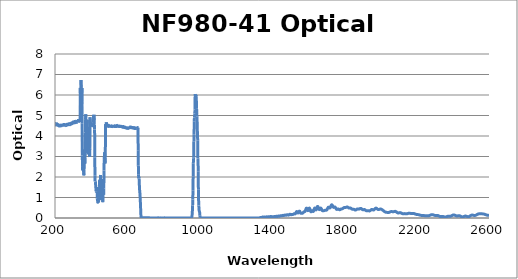
| Category | Optical Density |
|---|---|
| 2600.0 | 0.134 |
| 2599.0 | 0.133 |
| 2598.0 | 0.132 |
| 2597.0 | 0.131 |
| 2596.0 | 0.131 |
| 2595.0 | 0.132 |
| 2594.0 | 0.132 |
| 2593.0 | 0.133 |
| 2592.0 | 0.134 |
| 2591.0 | 0.135 |
| 2590.0 | 0.137 |
| 2589.0 | 0.139 |
| 2588.0 | 0.141 |
| 2587.0 | 0.144 |
| 2586.0 | 0.147 |
| 2585.0 | 0.15 |
| 2584.0 | 0.153 |
| 2583.0 | 0.157 |
| 2582.0 | 0.161 |
| 2581.0 | 0.164 |
| 2580.0 | 0.168 |
| 2579.0 | 0.171 |
| 2578.0 | 0.174 |
| 2577.0 | 0.177 |
| 2576.0 | 0.181 |
| 2575.0 | 0.184 |
| 2574.0 | 0.187 |
| 2573.0 | 0.189 |
| 2572.0 | 0.191 |
| 2571.0 | 0.193 |
| 2570.0 | 0.195 |
| 2569.0 | 0.197 |
| 2568.0 | 0.198 |
| 2567.0 | 0.199 |
| 2566.0 | 0.2 |
| 2565.0 | 0.201 |
| 2564.0 | 0.201 |
| 2563.0 | 0.202 |
| 2562.0 | 0.202 |
| 2561.0 | 0.203 |
| 2560.0 | 0.203 |
| 2559.0 | 0.203 |
| 2558.0 | 0.203 |
| 2557.0 | 0.204 |
| 2556.0 | 0.204 |
| 2555.0 | 0.204 |
| 2554.0 | 0.205 |
| 2553.0 | 0.205 |
| 2552.0 | 0.205 |
| 2551.0 | 0.205 |
| 2550.0 | 0.206 |
| 2549.0 | 0.206 |
| 2548.0 | 0.206 |
| 2547.0 | 0.205 |
| 2546.0 | 0.205 |
| 2545.0 | 0.204 |
| 2544.0 | 0.202 |
| 2543.0 | 0.201 |
| 2542.0 | 0.199 |
| 2541.0 | 0.196 |
| 2540.0 | 0.194 |
| 2539.0 | 0.19 |
| 2538.0 | 0.187 |
| 2537.0 | 0.183 |
| 2536.0 | 0.178 |
| 2535.0 | 0.174 |
| 2534.0 | 0.169 |
| 2533.0 | 0.164 |
| 2532.0 | 0.158 |
| 2531.0 | 0.153 |
| 2530.0 | 0.149 |
| 2529.0 | 0.144 |
| 2528.0 | 0.139 |
| 2527.0 | 0.135 |
| 2526.0 | 0.132 |
| 2525.0 | 0.129 |
| 2524.0 | 0.126 |
| 2523.0 | 0.125 |
| 2522.0 | 0.123 |
| 2521.0 | 0.123 |
| 2520.0 | 0.122 |
| 2519.0 | 0.123 |
| 2518.0 | 0.124 |
| 2517.0 | 0.125 |
| 2516.0 | 0.127 |
| 2515.0 | 0.129 |
| 2514.0 | 0.131 |
| 2513.0 | 0.134 |
| 2512.0 | 0.136 |
| 2511.0 | 0.138 |
| 2510.0 | 0.14 |
| 2509.0 | 0.141 |
| 2508.0 | 0.142 |
| 2507.0 | 0.143 |
| 2506.0 | 0.142 |
| 2505.0 | 0.141 |
| 2504.0 | 0.14 |
| 2503.0 | 0.137 |
| 2502.0 | 0.134 |
| 2501.0 | 0.131 |
| 2500.0 | 0.126 |
| 2499.0 | 0.121 |
| 2498.0 | 0.116 |
| 2497.0 | 0.11 |
| 2496.0 | 0.104 |
| 2495.0 | 0.098 |
| 2494.0 | 0.092 |
| 2493.0 | 0.087 |
| 2492.0 | 0.082 |
| 2491.0 | 0.077 |
| 2490.0 | 0.072 |
| 2489.0 | 0.069 |
| 2488.0 | 0.066 |
| 2487.0 | 0.063 |
| 2486.0 | 0.062 |
| 2485.0 | 0.062 |
| 2484.0 | 0.062 |
| 2483.0 | 0.063 |
| 2482.0 | 0.065 |
| 2481.0 | 0.067 |
| 2480.0 | 0.07 |
| 2479.0 | 0.073 |
| 2478.0 | 0.076 |
| 2477.0 | 0.079 |
| 2476.0 | 0.083 |
| 2475.0 | 0.086 |
| 2474.0 | 0.088 |
| 2473.0 | 0.091 |
| 2472.0 | 0.092 |
| 2471.0 | 0.094 |
| 2470.0 | 0.094 |
| 2469.0 | 0.094 |
| 2468.0 | 0.093 |
| 2467.0 | 0.091 |
| 2466.0 | 0.089 |
| 2465.0 | 0.086 |
| 2464.0 | 0.083 |
| 2463.0 | 0.079 |
| 2462.0 | 0.075 |
| 2461.0 | 0.071 |
| 2460.0 | 0.067 |
| 2459.0 | 0.064 |
| 2458.0 | 0.061 |
| 2457.0 | 0.058 |
| 2456.0 | 0.056 |
| 2455.0 | 0.054 |
| 2454.0 | 0.053 |
| 2453.0 | 0.054 |
| 2452.0 | 0.054 |
| 2451.0 | 0.056 |
| 2450.0 | 0.058 |
| 2449.0 | 0.062 |
| 2448.0 | 0.065 |
| 2447.0 | 0.069 |
| 2446.0 | 0.074 |
| 2445.0 | 0.079 |
| 2444.0 | 0.084 |
| 2443.0 | 0.088 |
| 2442.0 | 0.093 |
| 2441.0 | 0.098 |
| 2440.0 | 0.101 |
| 2439.0 | 0.105 |
| 2438.0 | 0.108 |
| 2437.0 | 0.11 |
| 2436.0 | 0.111 |
| 2435.0 | 0.112 |
| 2434.0 | 0.112 |
| 2433.0 | 0.112 |
| 2432.0 | 0.111 |
| 2431.0 | 0.11 |
| 2430.0 | 0.109 |
| 2429.0 | 0.107 |
| 2428.0 | 0.105 |
| 2427.0 | 0.104 |
| 2426.0 | 0.103 |
| 2425.0 | 0.101 |
| 2424.0 | 0.101 |
| 2423.0 | 0.101 |
| 2422.0 | 0.101 |
| 2421.0 | 0.102 |
| 2420.0 | 0.104 |
| 2419.0 | 0.106 |
| 2418.0 | 0.108 |
| 2417.0 | 0.112 |
| 2416.0 | 0.115 |
| 2415.0 | 0.119 |
| 2414.0 | 0.124 |
| 2413.0 | 0.128 |
| 2412.0 | 0.132 |
| 2411.0 | 0.136 |
| 2410.0 | 0.14 |
| 2409.0 | 0.143 |
| 2408.0 | 0.145 |
| 2407.0 | 0.147 |
| 2406.0 | 0.148 |
| 2405.0 | 0.149 |
| 2404.0 | 0.149 |
| 2403.0 | 0.147 |
| 2402.0 | 0.146 |
| 2401.0 | 0.143 |
| 2400.0 | 0.14 |
| 2399.0 | 0.136 |
| 2398.0 | 0.132 |
| 2397.0 | 0.127 |
| 2396.0 | 0.122 |
| 2395.0 | 0.117 |
| 2394.0 | 0.112 |
| 2393.0 | 0.108 |
| 2392.0 | 0.103 |
| 2391.0 | 0.099 |
| 2390.0 | 0.096 |
| 2389.0 | 0.093 |
| 2388.0 | 0.09 |
| 2387.0 | 0.089 |
| 2386.0 | 0.087 |
| 2385.0 | 0.087 |
| 2384.0 | 0.086 |
| 2383.0 | 0.087 |
| 2382.0 | 0.087 |
| 2381.0 | 0.088 |
| 2380.0 | 0.088 |
| 2379.0 | 0.089 |
| 2378.0 | 0.089 |
| 2377.0 | 0.089 |
| 2376.0 | 0.089 |
| 2375.0 | 0.089 |
| 2374.0 | 0.087 |
| 2373.0 | 0.086 |
| 2372.0 | 0.084 |
| 2371.0 | 0.081 |
| 2370.0 | 0.078 |
| 2369.0 | 0.075 |
| 2368.0 | 0.071 |
| 2367.0 | 0.068 |
| 2366.0 | 0.064 |
| 2365.0 | 0.06 |
| 2364.0 | 0.057 |
| 2363.0 | 0.054 |
| 2362.0 | 0.051 |
| 2361.0 | 0.049 |
| 2360.0 | 0.047 |
| 2359.0 | 0.046 |
| 2358.0 | 0.046 |
| 2357.0 | 0.047 |
| 2356.0 | 0.048 |
| 2355.0 | 0.049 |
| 2354.0 | 0.051 |
| 2353.0 | 0.054 |
| 2352.0 | 0.056 |
| 2351.0 | 0.059 |
| 2350.0 | 0.062 |
| 2349.0 | 0.065 |
| 2348.0 | 0.067 |
| 2347.0 | 0.07 |
| 2346.0 | 0.072 |
| 2345.0 | 0.073 |
| 2344.0 | 0.074 |
| 2343.0 | 0.075 |
| 2342.0 | 0.075 |
| 2341.0 | 0.075 |
| 2340.0 | 0.074 |
| 2339.0 | 0.073 |
| 2338.0 | 0.072 |
| 2337.0 | 0.072 |
| 2336.0 | 0.071 |
| 2335.0 | 0.07 |
| 2334.0 | 0.07 |
| 2333.0 | 0.07 |
| 2332.0 | 0.071 |
| 2331.0 | 0.072 |
| 2330.0 | 0.074 |
| 2329.0 | 0.076 |
| 2328.0 | 0.079 |
| 2327.0 | 0.083 |
| 2326.0 | 0.086 |
| 2325.0 | 0.091 |
| 2324.0 | 0.095 |
| 2323.0 | 0.099 |
| 2322.0 | 0.104 |
| 2321.0 | 0.108 |
| 2320.0 | 0.112 |
| 2319.0 | 0.116 |
| 2318.0 | 0.119 |
| 2317.0 | 0.122 |
| 2316.0 | 0.124 |
| 2315.0 | 0.125 |
| 2314.0 | 0.127 |
| 2313.0 | 0.127 |
| 2312.0 | 0.127 |
| 2311.0 | 0.127 |
| 2310.0 | 0.126 |
| 2309.0 | 0.126 |
| 2308.0 | 0.125 |
| 2307.0 | 0.124 |
| 2306.0 | 0.123 |
| 2305.0 | 0.123 |
| 2304.0 | 0.123 |
| 2303.0 | 0.123 |
| 2302.0 | 0.124 |
| 2301.0 | 0.125 |
| 2300.0 | 0.127 |
| 2299.0 | 0.129 |
| 2298.0 | 0.132 |
| 2297.0 | 0.135 |
| 2296.0 | 0.138 |
| 2295.0 | 0.141 |
| 2294.0 | 0.145 |
| 2293.0 | 0.148 |
| 2292.0 | 0.152 |
| 2291.0 | 0.155 |
| 2290.0 | 0.157 |
| 2289.0 | 0.16 |
| 2288.0 | 0.161 |
| 2287.0 | 0.163 |
| 2286.0 | 0.163 |
| 2285.0 | 0.163 |
| 2284.0 | 0.163 |
| 2283.0 | 0.162 |
| 2282.0 | 0.16 |
| 2281.0 | 0.158 |
| 2280.0 | 0.155 |
| 2279.0 | 0.152 |
| 2278.0 | 0.149 |
| 2277.0 | 0.145 |
| 2276.0 | 0.141 |
| 2275.0 | 0.137 |
| 2274.0 | 0.133 |
| 2273.0 | 0.129 |
| 2272.0 | 0.126 |
| 2271.0 | 0.122 |
| 2270.0 | 0.119 |
| 2269.0 | 0.117 |
| 2268.0 | 0.114 |
| 2267.0 | 0.112 |
| 2266.0 | 0.111 |
| 2265.0 | 0.109 |
| 2264.0 | 0.108 |
| 2263.0 | 0.108 |
| 2262.0 | 0.107 |
| 2261.0 | 0.107 |
| 2260.0 | 0.106 |
| 2259.0 | 0.106 |
| 2258.0 | 0.106 |
| 2257.0 | 0.107 |
| 2256.0 | 0.107 |
| 2255.0 | 0.107 |
| 2254.0 | 0.107 |
| 2253.0 | 0.108 |
| 2252.0 | 0.108 |
| 2251.0 | 0.108 |
| 2250.0 | 0.109 |
| 2249.0 | 0.11 |
| 2248.0 | 0.11 |
| 2247.0 | 0.111 |
| 2246.0 | 0.112 |
| 2245.0 | 0.113 |
| 2244.0 | 0.114 |
| 2243.0 | 0.115 |
| 2242.0 | 0.116 |
| 2241.0 | 0.118 |
| 2240.0 | 0.119 |
| 2239.0 | 0.12 |
| 2238.0 | 0.121 |
| 2237.0 | 0.122 |
| 2236.0 | 0.122 |
| 2235.0 | 0.123 |
| 2234.0 | 0.124 |
| 2233.0 | 0.124 |
| 2232.0 | 0.124 |
| 2231.0 | 0.125 |
| 2230.0 | 0.125 |
| 2229.0 | 0.125 |
| 2228.0 | 0.126 |
| 2227.0 | 0.126 |
| 2226.0 | 0.127 |
| 2225.0 | 0.128 |
| 2224.0 | 0.129 |
| 2223.0 | 0.13 |
| 2222.0 | 0.132 |
| 2221.0 | 0.134 |
| 2220.0 | 0.136 |
| 2219.0 | 0.138 |
| 2218.0 | 0.141 |
| 2217.0 | 0.144 |
| 2216.0 | 0.147 |
| 2215.0 | 0.149 |
| 2214.0 | 0.152 |
| 2213.0 | 0.155 |
| 2212.0 | 0.157 |
| 2211.0 | 0.159 |
| 2210.0 | 0.162 |
| 2209.0 | 0.163 |
| 2208.0 | 0.165 |
| 2207.0 | 0.166 |
| 2206.0 | 0.167 |
| 2205.0 | 0.168 |
| 2204.0 | 0.169 |
| 2203.0 | 0.169 |
| 2202.0 | 0.17 |
| 2201.0 | 0.171 |
| 2200.0 | 0.173 |
| 2199.0 | 0.174 |
| 2198.0 | 0.176 |
| 2197.0 | 0.178 |
| 2196.0 | 0.181 |
| 2195.0 | 0.184 |
| 2194.0 | 0.187 |
| 2193.0 | 0.191 |
| 2192.0 | 0.194 |
| 2191.0 | 0.198 |
| 2190.0 | 0.202 |
| 2189.0 | 0.206 |
| 2188.0 | 0.209 |
| 2187.0 | 0.213 |
| 2186.0 | 0.216 |
| 2185.0 | 0.218 |
| 2184.0 | 0.22 |
| 2183.0 | 0.222 |
| 2182.0 | 0.223 |
| 2181.0 | 0.223 |
| 2180.0 | 0.223 |
| 2179.0 | 0.223 |
| 2178.0 | 0.222 |
| 2177.0 | 0.222 |
| 2176.0 | 0.221 |
| 2175.0 | 0.22 |
| 2174.0 | 0.22 |
| 2173.0 | 0.219 |
| 2172.0 | 0.219 |
| 2171.0 | 0.219 |
| 2170.0 | 0.22 |
| 2169.0 | 0.221 |
| 2168.0 | 0.222 |
| 2167.0 | 0.223 |
| 2166.0 | 0.225 |
| 2165.0 | 0.226 |
| 2164.0 | 0.228 |
| 2163.0 | 0.23 |
| 2162.0 | 0.231 |
| 2161.0 | 0.232 |
| 2160.0 | 0.233 |
| 2159.0 | 0.233 |
| 2158.0 | 0.233 |
| 2157.0 | 0.232 |
| 2156.0 | 0.23 |
| 2155.0 | 0.228 |
| 2154.0 | 0.226 |
| 2153.0 | 0.224 |
| 2152.0 | 0.221 |
| 2151.0 | 0.218 |
| 2150.0 | 0.215 |
| 2149.0 | 0.212 |
| 2148.0 | 0.21 |
| 2147.0 | 0.208 |
| 2146.0 | 0.206 |
| 2145.0 | 0.205 |
| 2144.0 | 0.205 |
| 2143.0 | 0.205 |
| 2142.0 | 0.205 |
| 2141.0 | 0.206 |
| 2140.0 | 0.207 |
| 2139.0 | 0.208 |
| 2138.0 | 0.21 |
| 2137.0 | 0.211 |
| 2136.0 | 0.212 |
| 2135.0 | 0.213 |
| 2134.0 | 0.213 |
| 2133.0 | 0.213 |
| 2132.0 | 0.213 |
| 2131.0 | 0.213 |
| 2130.0 | 0.212 |
| 2129.0 | 0.211 |
| 2128.0 | 0.21 |
| 2127.0 | 0.209 |
| 2126.0 | 0.209 |
| 2125.0 | 0.208 |
| 2124.0 | 0.209 |
| 2123.0 | 0.21 |
| 2122.0 | 0.212 |
| 2121.0 | 0.214 |
| 2120.0 | 0.217 |
| 2119.0 | 0.221 |
| 2118.0 | 0.225 |
| 2117.0 | 0.23 |
| 2116.0 | 0.235 |
| 2115.0 | 0.24 |
| 2114.0 | 0.245 |
| 2113.0 | 0.25 |
| 2112.0 | 0.254 |
| 2111.0 | 0.258 |
| 2110.0 | 0.26 |
| 2109.0 | 0.262 |
| 2108.0 | 0.263 |
| 2107.0 | 0.262 |
| 2106.0 | 0.261 |
| 2105.0 | 0.26 |
| 2104.0 | 0.257 |
| 2103.0 | 0.255 |
| 2102.0 | 0.252 |
| 2101.0 | 0.25 |
| 2100.0 | 0.248 |
| 2099.0 | 0.247 |
| 2098.0 | 0.246 |
| 2097.0 | 0.247 |
| 2096.0 | 0.249 |
| 2095.0 | 0.252 |
| 2094.0 | 0.256 |
| 2093.0 | 0.261 |
| 2092.0 | 0.267 |
| 2091.0 | 0.274 |
| 2090.0 | 0.281 |
| 2089.0 | 0.288 |
| 2088.0 | 0.295 |
| 2087.0 | 0.302 |
| 2086.0 | 0.308 |
| 2085.0 | 0.313 |
| 2084.0 | 0.318 |
| 2083.0 | 0.321 |
| 2082.0 | 0.323 |
| 2081.0 | 0.324 |
| 2080.0 | 0.324 |
| 2079.0 | 0.323 |
| 2078.0 | 0.321 |
| 2077.0 | 0.318 |
| 2076.0 | 0.316 |
| 2075.0 | 0.313 |
| 2074.0 | 0.31 |
| 2073.0 | 0.308 |
| 2072.0 | 0.306 |
| 2071.0 | 0.305 |
| 2070.0 | 0.304 |
| 2069.0 | 0.304 |
| 2068.0 | 0.305 |
| 2067.0 | 0.306 |
| 2066.0 | 0.307 |
| 2065.0 | 0.309 |
| 2064.0 | 0.311 |
| 2063.0 | 0.312 |
| 2062.0 | 0.313 |
| 2061.0 | 0.314 |
| 2060.0 | 0.314 |
| 2059.0 | 0.314 |
| 2058.0 | 0.312 |
| 2057.0 | 0.31 |
| 2056.0 | 0.307 |
| 2055.0 | 0.304 |
| 2054.0 | 0.3 |
| 2053.0 | 0.296 |
| 2052.0 | 0.291 |
| 2051.0 | 0.287 |
| 2050.0 | 0.283 |
| 2049.0 | 0.279 |
| 2048.0 | 0.276 |
| 2047.0 | 0.273 |
| 2046.0 | 0.271 |
| 2045.0 | 0.27 |
| 2044.0 | 0.269 |
| 2043.0 | 0.269 |
| 2042.0 | 0.269 |
| 2041.0 | 0.27 |
| 2040.0 | 0.271 |
| 2039.0 | 0.271 |
| 2038.0 | 0.272 |
| 2037.0 | 0.273 |
| 2036.0 | 0.274 |
| 2035.0 | 0.275 |
| 2034.0 | 0.276 |
| 2033.0 | 0.277 |
| 2032.0 | 0.279 |
| 2031.0 | 0.28 |
| 2030.0 | 0.282 |
| 2029.0 | 0.284 |
| 2028.0 | 0.287 |
| 2027.0 | 0.29 |
| 2026.0 | 0.294 |
| 2025.0 | 0.298 |
| 2024.0 | 0.303 |
| 2023.0 | 0.309 |
| 2022.0 | 0.315 |
| 2021.0 | 0.321 |
| 2020.0 | 0.328 |
| 2019.0 | 0.335 |
| 2018.0 | 0.342 |
| 2017.0 | 0.35 |
| 2016.0 | 0.357 |
| 2015.0 | 0.364 |
| 2014.0 | 0.371 |
| 2013.0 | 0.378 |
| 2012.0 | 0.385 |
| 2011.0 | 0.391 |
| 2010.0 | 0.398 |
| 2009.0 | 0.404 |
| 2008.0 | 0.41 |
| 2007.0 | 0.415 |
| 2006.0 | 0.421 |
| 2005.0 | 0.425 |
| 2004.0 | 0.43 |
| 2003.0 | 0.433 |
| 2002.0 | 0.436 |
| 2001.0 | 0.437 |
| 2000.0 | 0.438 |
| 1999.0 | 0.438 |
| 1998.0 | 0.437 |
| 1997.0 | 0.434 |
| 1996.0 | 0.432 |
| 1995.0 | 0.428 |
| 1994.0 | 0.424 |
| 1993.0 | 0.42 |
| 1992.0 | 0.417 |
| 1991.0 | 0.414 |
| 1990.0 | 0.412 |
| 1989.0 | 0.411 |
| 1988.0 | 0.412 |
| 1987.0 | 0.414 |
| 1986.0 | 0.417 |
| 1985.0 | 0.422 |
| 1984.0 | 0.428 |
| 1983.0 | 0.435 |
| 1982.0 | 0.443 |
| 1981.0 | 0.452 |
| 1980.0 | 0.46 |
| 1979.0 | 0.467 |
| 1978.0 | 0.473 |
| 1977.0 | 0.478 |
| 1976.0 | 0.481 |
| 1975.0 | 0.482 |
| 1974.0 | 0.481 |
| 1973.0 | 0.477 |
| 1972.0 | 0.471 |
| 1971.0 | 0.464 |
| 1970.0 | 0.455 |
| 1969.0 | 0.445 |
| 1968.0 | 0.435 |
| 1967.0 | 0.425 |
| 1966.0 | 0.415 |
| 1965.0 | 0.406 |
| 1964.0 | 0.399 |
| 1963.0 | 0.394 |
| 1962.0 | 0.391 |
| 1961.0 | 0.39 |
| 1960.0 | 0.391 |
| 1959.0 | 0.393 |
| 1958.0 | 0.397 |
| 1957.0 | 0.401 |
| 1956.0 | 0.406 |
| 1955.0 | 0.41 |
| 1954.0 | 0.413 |
| 1953.0 | 0.415 |
| 1952.0 | 0.415 |
| 1951.0 | 0.414 |
| 1950.0 | 0.411 |
| 1949.0 | 0.405 |
| 1948.0 | 0.399 |
| 1947.0 | 0.391 |
| 1946.0 | 0.383 |
| 1945.0 | 0.374 |
| 1944.0 | 0.367 |
| 1943.0 | 0.36 |
| 1942.0 | 0.354 |
| 1941.0 | 0.349 |
| 1940.0 | 0.346 |
| 1939.0 | 0.345 |
| 1938.0 | 0.345 |
| 1937.0 | 0.347 |
| 1936.0 | 0.349 |
| 1935.0 | 0.351 |
| 1934.0 | 0.354 |
| 1933.0 | 0.356 |
| 1932.0 | 0.358 |
| 1931.0 | 0.358 |
| 1930.0 | 0.358 |
| 1929.0 | 0.357 |
| 1928.0 | 0.356 |
| 1927.0 | 0.354 |
| 1926.0 | 0.352 |
| 1925.0 | 0.35 |
| 1924.0 | 0.35 |
| 1923.0 | 0.35 |
| 1922.0 | 0.352 |
| 1921.0 | 0.355 |
| 1920.0 | 0.36 |
| 1919.0 | 0.366 |
| 1918.0 | 0.373 |
| 1917.0 | 0.38 |
| 1916.0 | 0.387 |
| 1915.0 | 0.394 |
| 1914.0 | 0.4 |
| 1913.0 | 0.406 |
| 1912.0 | 0.41 |
| 1911.0 | 0.412 |
| 1910.0 | 0.413 |
| 1909.0 | 0.412 |
| 1908.0 | 0.41 |
| 1907.0 | 0.408 |
| 1906.0 | 0.405 |
| 1905.0 | 0.403 |
| 1904.0 | 0.401 |
| 1903.0 | 0.401 |
| 1902.0 | 0.402 |
| 1901.0 | 0.406 |
| 1900.0 | 0.411 |
| 1899.0 | 0.417 |
| 1898.0 | 0.424 |
| 1897.0 | 0.432 |
| 1896.0 | 0.441 |
| 1895.0 | 0.449 |
| 1894.0 | 0.456 |
| 1893.0 | 0.461 |
| 1892.0 | 0.466 |
| 1891.0 | 0.468 |
| 1890.0 | 0.469 |
| 1889.0 | 0.467 |
| 1888.0 | 0.464 |
| 1887.0 | 0.46 |
| 1886.0 | 0.454 |
| 1885.0 | 0.449 |
| 1884.0 | 0.444 |
| 1883.0 | 0.439 |
| 1882.0 | 0.435 |
| 1881.0 | 0.433 |
| 1880.0 | 0.433 |
| 1879.0 | 0.433 |
| 1878.0 | 0.435 |
| 1877.0 | 0.437 |
| 1876.0 | 0.439 |
| 1875.0 | 0.442 |
| 1874.0 | 0.443 |
| 1873.0 | 0.443 |
| 1872.0 | 0.442 |
| 1871.0 | 0.438 |
| 1870.0 | 0.434 |
| 1869.0 | 0.428 |
| 1868.0 | 0.421 |
| 1867.0 | 0.413 |
| 1866.0 | 0.406 |
| 1865.0 | 0.4 |
| 1864.0 | 0.395 |
| 1863.0 | 0.391 |
| 1862.0 | 0.388 |
| 1861.0 | 0.388 |
| 1860.0 | 0.39 |
| 1859.0 | 0.393 |
| 1858.0 | 0.398 |
| 1857.0 | 0.404 |
| 1856.0 | 0.409 |
| 1855.0 | 0.415 |
| 1854.0 | 0.419 |
| 1853.0 | 0.423 |
| 1852.0 | 0.426 |
| 1851.0 | 0.427 |
| 1850.0 | 0.427 |
| 1849.0 | 0.426 |
| 1848.0 | 0.425 |
| 1847.0 | 0.424 |
| 1846.0 | 0.424 |
| 1845.0 | 0.424 |
| 1844.0 | 0.426 |
| 1843.0 | 0.43 |
| 1842.0 | 0.435 |
| 1841.0 | 0.441 |
| 1840.0 | 0.448 |
| 1839.0 | 0.456 |
| 1838.0 | 0.464 |
| 1837.0 | 0.471 |
| 1836.0 | 0.477 |
| 1835.0 | 0.482 |
| 1834.0 | 0.486 |
| 1833.0 | 0.488 |
| 1832.0 | 0.489 |
| 1831.0 | 0.488 |
| 1830.0 | 0.487 |
| 1829.0 | 0.486 |
| 1828.0 | 0.486 |
| 1827.0 | 0.486 |
| 1826.0 | 0.487 |
| 1825.0 | 0.49 |
| 1824.0 | 0.494 |
| 1823.0 | 0.499 |
| 1822.0 | 0.506 |
| 1821.0 | 0.513 |
| 1820.0 | 0.52 |
| 1819.0 | 0.526 |
| 1818.0 | 0.532 |
| 1817.0 | 0.536 |
| 1816.0 | 0.538 |
| 1815.0 | 0.538 |
| 1814.0 | 0.537 |
| 1813.0 | 0.534 |
| 1812.0 | 0.531 |
| 1811.0 | 0.526 |
| 1810.0 | 0.522 |
| 1809.0 | 0.518 |
| 1808.0 | 0.515 |
| 1807.0 | 0.512 |
| 1806.0 | 0.511 |
| 1805.0 | 0.51 |
| 1804.0 | 0.511 |
| 1803.0 | 0.512 |
| 1802.0 | 0.513 |
| 1801.0 | 0.513 |
| 1800.0 | 0.512 |
| 1799.0 | 0.51 |
| 1798.0 | 0.507 |
| 1797.0 | 0.502 |
| 1796.0 | 0.496 |
| 1795.0 | 0.489 |
| 1794.0 | 0.482 |
| 1793.0 | 0.474 |
| 1792.0 | 0.466 |
| 1791.0 | 0.46 |
| 1790.0 | 0.454 |
| 1789.0 | 0.45 |
| 1788.0 | 0.447 |
| 1787.0 | 0.445 |
| 1786.0 | 0.444 |
| 1785.0 | 0.443 |
| 1784.0 | 0.441 |
| 1783.0 | 0.439 |
| 1782.0 | 0.436 |
| 1781.0 | 0.432 |
| 1780.0 | 0.427 |
| 1779.0 | 0.422 |
| 1778.0 | 0.416 |
| 1777.0 | 0.411 |
| 1776.0 | 0.407 |
| 1775.0 | 0.405 |
| 1774.0 | 0.404 |
| 1773.0 | 0.406 |
| 1772.0 | 0.41 |
| 1771.0 | 0.415 |
| 1770.0 | 0.421 |
| 1769.0 | 0.428 |
| 1768.0 | 0.433 |
| 1767.0 | 0.438 |
| 1766.0 | 0.44 |
| 1765.0 | 0.44 |
| 1764.0 | 0.437 |
| 1763.0 | 0.433 |
| 1762.0 | 0.429 |
| 1761.0 | 0.423 |
| 1760.0 | 0.42 |
| 1759.0 | 0.418 |
| 1758.0 | 0.419 |
| 1757.0 | 0.424 |
| 1756.0 | 0.433 |
| 1755.0 | 0.445 |
| 1754.0 | 0.459 |
| 1753.0 | 0.476 |
| 1752.0 | 0.491 |
| 1751.0 | 0.506 |
| 1750.0 | 0.519 |
| 1749.0 | 0.529 |
| 1748.0 | 0.534 |
| 1747.0 | 0.536 |
| 1746.0 | 0.535 |
| 1745.0 | 0.531 |
| 1744.0 | 0.526 |
| 1743.0 | 0.521 |
| 1742.0 | 0.518 |
| 1741.0 | 0.517 |
| 1740.0 | 0.521 |
| 1739.0 | 0.529 |
| 1738.0 | 0.541 |
| 1737.0 | 0.557 |
| 1736.0 | 0.575 |
| 1735.0 | 0.594 |
| 1734.0 | 0.612 |
| 1733.0 | 0.627 |
| 1732.0 | 0.637 |
| 1731.0 | 0.643 |
| 1730.0 | 0.643 |
| 1729.0 | 0.636 |
| 1728.0 | 0.624 |
| 1727.0 | 0.607 |
| 1726.0 | 0.587 |
| 1725.0 | 0.565 |
| 1724.0 | 0.542 |
| 1723.0 | 0.523 |
| 1722.0 | 0.506 |
| 1721.0 | 0.495 |
| 1720.0 | 0.49 |
| 1719.0 | 0.49 |
| 1718.0 | 0.494 |
| 1717.0 | 0.502 |
| 1716.0 | 0.511 |
| 1715.0 | 0.52 |
| 1714.0 | 0.526 |
| 1713.0 | 0.529 |
| 1712.0 | 0.527 |
| 1711.0 | 0.521 |
| 1710.0 | 0.509 |
| 1709.0 | 0.494 |
| 1708.0 | 0.476 |
| 1707.0 | 0.457 |
| 1706.0 | 0.438 |
| 1705.0 | 0.421 |
| 1704.0 | 0.406 |
| 1703.0 | 0.395 |
| 1702.0 | 0.387 |
| 1701.0 | 0.383 |
| 1700.0 | 0.381 |
| 1699.0 | 0.382 |
| 1698.0 | 0.382 |
| 1697.0 | 0.383 |
| 1696.0 | 0.383 |
| 1695.0 | 0.382 |
| 1694.0 | 0.38 |
| 1693.0 | 0.376 |
| 1692.0 | 0.372 |
| 1691.0 | 0.368 |
| 1690.0 | 0.364 |
| 1689.0 | 0.361 |
| 1688.0 | 0.359 |
| 1687.0 | 0.356 |
| 1686.0 | 0.354 |
| 1685.0 | 0.353 |
| 1684.0 | 0.351 |
| 1683.0 | 0.349 |
| 1682.0 | 0.348 |
| 1681.0 | 0.348 |
| 1680.0 | 0.35 |
| 1679.0 | 0.355 |
| 1678.0 | 0.363 |
| 1677.0 | 0.375 |
| 1676.0 | 0.39 |
| 1675.0 | 0.407 |
| 1674.0 | 0.426 |
| 1673.0 | 0.445 |
| 1672.0 | 0.461 |
| 1671.0 | 0.474 |
| 1670.0 | 0.482 |
| 1669.0 | 0.483 |
| 1668.0 | 0.479 |
| 1667.0 | 0.47 |
| 1666.0 | 0.456 |
| 1665.0 | 0.44 |
| 1664.0 | 0.425 |
| 1663.0 | 0.414 |
| 1662.0 | 0.409 |
| 1661.0 | 0.411 |
| 1660.0 | 0.421 |
| 1659.0 | 0.439 |
| 1658.0 | 0.463 |
| 1657.0 | 0.49 |
| 1656.0 | 0.515 |
| 1655.0 | 0.539 |
| 1654.0 | 0.556 |
| 1653.0 | 0.565 |
| 1652.0 | 0.565 |
| 1651.0 | 0.555 |
| 1650.0 | 0.536 |
| 1649.0 | 0.511 |
| 1648.0 | 0.482 |
| 1647.0 | 0.452 |
| 1646.0 | 0.426 |
| 1645.0 | 0.407 |
| 1644.0 | 0.396 |
| 1643.0 | 0.396 |
| 1642.0 | 0.404 |
| 1641.0 | 0.42 |
| 1640.0 | 0.439 |
| 1639.0 | 0.459 |
| 1638.0 | 0.475 |
| 1637.0 | 0.484 |
| 1636.0 | 0.484 |
| 1635.0 | 0.475 |
| 1634.0 | 0.458 |
| 1633.0 | 0.433 |
| 1632.0 | 0.404 |
| 1631.0 | 0.375 |
| 1630.0 | 0.35 |
| 1629.0 | 0.33 |
| 1628.0 | 0.319 |
| 1627.0 | 0.317 |
| 1626.0 | 0.322 |
| 1625.0 | 0.332 |
| 1624.0 | 0.344 |
| 1623.0 | 0.354 |
| 1622.0 | 0.359 |
| 1621.0 | 0.358 |
| 1620.0 | 0.351 |
| 1619.0 | 0.338 |
| 1618.0 | 0.324 |
| 1617.0 | 0.312 |
| 1616.0 | 0.304 |
| 1615.0 | 0.305 |
| 1614.0 | 0.314 |
| 1613.0 | 0.334 |
| 1612.0 | 0.361 |
| 1611.0 | 0.391 |
| 1610.0 | 0.422 |
| 1609.0 | 0.45 |
| 1608.0 | 0.47 |
| 1607.0 | 0.481 |
| 1606.0 | 0.482 |
| 1605.0 | 0.472 |
| 1604.0 | 0.455 |
| 1603.0 | 0.431 |
| 1602.0 | 0.406 |
| 1601.0 | 0.383 |
| 1600.0 | 0.367 |
| 1599.0 | 0.36 |
| 1598.0 | 0.363 |
| 1597.0 | 0.375 |
| 1596.0 | 0.396 |
| 1595.0 | 0.42 |
| 1594.0 | 0.444 |
| 1593.0 | 0.465 |
| 1592.0 | 0.478 |
| 1591.0 | 0.483 |
| 1590.0 | 0.478 |
| 1589.0 | 0.465 |
| 1588.0 | 0.444 |
| 1587.0 | 0.419 |
| 1586.0 | 0.392 |
| 1585.0 | 0.367 |
| 1584.0 | 0.344 |
| 1583.0 | 0.327 |
| 1582.0 | 0.316 |
| 1581.0 | 0.31 |
| 1580.0 | 0.307 |
| 1579.0 | 0.307 |
| 1578.0 | 0.306 |
| 1577.0 | 0.304 |
| 1576.0 | 0.298 |
| 1575.0 | 0.289 |
| 1574.0 | 0.278 |
| 1573.0 | 0.267 |
| 1572.0 | 0.255 |
| 1571.0 | 0.245 |
| 1570.0 | 0.238 |
| 1569.0 | 0.234 |
| 1568.0 | 0.232 |
| 1567.0 | 0.232 |
| 1566.0 | 0.232 |
| 1565.0 | 0.232 |
| 1564.0 | 0.23 |
| 1563.0 | 0.228 |
| 1562.0 | 0.226 |
| 1561.0 | 0.226 |
| 1560.0 | 0.229 |
| 1559.0 | 0.236 |
| 1558.0 | 0.247 |
| 1557.0 | 0.263 |
| 1556.0 | 0.281 |
| 1555.0 | 0.3 |
| 1554.0 | 0.316 |
| 1553.0 | 0.329 |
| 1552.0 | 0.335 |
| 1551.0 | 0.335 |
| 1550.0 | 0.327 |
| 1549.0 | 0.314 |
| 1548.0 | 0.296 |
| 1547.0 | 0.278 |
| 1546.0 | 0.261 |
| 1545.0 | 0.249 |
| 1544.0 | 0.244 |
| 1543.0 | 0.246 |
| 1542.0 | 0.255 |
| 1541.0 | 0.269 |
| 1540.0 | 0.284 |
| 1539.0 | 0.299 |
| 1538.0 | 0.31 |
| 1537.0 | 0.315 |
| 1536.0 | 0.313 |
| 1535.0 | 0.304 |
| 1534.0 | 0.29 |
| 1533.0 | 0.272 |
| 1532.0 | 0.252 |
| 1531.0 | 0.234 |
| 1530.0 | 0.218 |
| 1529.0 | 0.207 |
| 1528.0 | 0.202 |
| 1527.0 | 0.2 |
| 1526.0 | 0.202 |
| 1525.0 | 0.205 |
| 1524.0 | 0.208 |
| 1523.0 | 0.209 |
| 1522.0 | 0.208 |
| 1521.0 | 0.204 |
| 1520.0 | 0.198 |
| 1519.0 | 0.191 |
| 1518.0 | 0.184 |
| 1517.0 | 0.179 |
| 1516.0 | 0.175 |
| 1515.0 | 0.173 |
| 1514.0 | 0.172 |
| 1513.0 | 0.173 |
| 1512.0 | 0.173 |
| 1511.0 | 0.172 |
| 1510.0 | 0.17 |
| 1509.0 | 0.168 |
| 1508.0 | 0.165 |
| 1507.0 | 0.162 |
| 1506.0 | 0.161 |
| 1505.0 | 0.161 |
| 1504.0 | 0.164 |
| 1503.0 | 0.168 |
| 1502.0 | 0.173 |
| 1501.0 | 0.178 |
| 1500.0 | 0.181 |
| 1499.0 | 0.182 |
| 1498.0 | 0.18 |
| 1497.0 | 0.175 |
| 1496.0 | 0.168 |
| 1495.0 | 0.16 |
| 1494.0 | 0.151 |
| 1493.0 | 0.145 |
| 1492.0 | 0.14 |
| 1491.0 | 0.139 |
| 1490.0 | 0.141 |
| 1489.0 | 0.145 |
| 1488.0 | 0.151 |
| 1487.0 | 0.156 |
| 1486.0 | 0.16 |
| 1485.0 | 0.162 |
| 1484.0 | 0.161 |
| 1483.0 | 0.157 |
| 1482.0 | 0.152 |
| 1481.0 | 0.145 |
| 1480.0 | 0.139 |
| 1479.0 | 0.135 |
| 1478.0 | 0.133 |
| 1477.0 | 0.133 |
| 1476.0 | 0.135 |
| 1475.0 | 0.138 |
| 1474.0 | 0.141 |
| 1473.0 | 0.143 |
| 1472.0 | 0.144 |
| 1471.0 | 0.142 |
| 1470.0 | 0.139 |
| 1469.0 | 0.135 |
| 1468.0 | 0.13 |
| 1467.0 | 0.126 |
| 1466.0 | 0.123 |
| 1465.0 | 0.122 |
| 1464.0 | 0.123 |
| 1463.0 | 0.125 |
| 1462.0 | 0.127 |
| 1461.0 | 0.128 |
| 1460.0 | 0.129 |
| 1459.0 | 0.127 |
| 1458.0 | 0.124 |
| 1457.0 | 0.12 |
| 1456.0 | 0.115 |
| 1455.0 | 0.111 |
| 1454.0 | 0.109 |
| 1453.0 | 0.107 |
| 1452.0 | 0.108 |
| 1451.0 | 0.109 |
| 1450.0 | 0.11 |
| 1449.0 | 0.111 |
| 1448.0 | 0.11 |
| 1447.0 | 0.107 |
| 1446.0 | 0.103 |
| 1445.0 | 0.098 |
| 1444.0 | 0.094 |
| 1443.0 | 0.091 |
| 1442.0 | 0.089 |
| 1441.0 | 0.09 |
| 1440.0 | 0.092 |
| 1439.0 | 0.094 |
| 1438.0 | 0.096 |
| 1437.0 | 0.097 |
| 1436.0 | 0.095 |
| 1435.0 | 0.092 |
| 1434.0 | 0.087 |
| 1433.0 | 0.082 |
| 1432.0 | 0.077 |
| 1431.0 | 0.075 |
| 1430.0 | 0.074 |
| 1429.0 | 0.076 |
| 1428.0 | 0.08 |
| 1427.0 | 0.084 |
| 1426.0 | 0.087 |
| 1425.0 | 0.087 |
| 1424.0 | 0.086 |
| 1423.0 | 0.082 |
| 1422.0 | 0.077 |
| 1421.0 | 0.072 |
| 1420.0 | 0.068 |
| 1419.0 | 0.066 |
| 1418.0 | 0.066 |
| 1417.0 | 0.068 |
| 1416.0 | 0.07 |
| 1415.0 | 0.072 |
| 1414.0 | 0.073 |
| 1413.0 | 0.072 |
| 1412.0 | 0.07 |
| 1411.0 | 0.067 |
| 1410.0 | 0.063 |
| 1409.0 | 0.06 |
| 1408.0 | 0.059 |
| 1407.0 | 0.059 |
| 1406.0 | 0.059 |
| 1405.0 | 0.06 |
| 1404.0 | 0.06 |
| 1403.0 | 0.059 |
| 1402.0 | 0.058 |
| 1401.0 | 0.056 |
| 1400.0 | 0.055 |
| 1399.0 | 0.056 |
| 1398.0 | 0.059 |
| 1397.0 | 0.063 |
| 1396.0 | 0.069 |
| 1395.0 | 0.074 |
| 1394.0 | 0.077 |
| 1393.0 | 0.076 |
| 1392.0 | 0.071 |
| 1391.0 | 0.064 |
| 1390.0 | 0.055 |
| 1389.0 | 0.047 |
| 1388.0 | 0.042 |
| 1387.0 | 0.041 |
| 1386.0 | 0.044 |
| 1385.0 | 0.05 |
| 1384.0 | 0.057 |
| 1383.0 | 0.063 |
| 1382.0 | 0.065 |
| 1381.0 | 0.063 |
| 1380.0 | 0.057 |
| 1379.0 | 0.05 |
| 1378.0 | 0.042 |
| 1377.0 | 0.037 |
| 1376.0 | 0.035 |
| 1375.0 | 0.038 |
| 1374.0 | 0.045 |
| 1373.0 | 0.052 |
| 1372.0 | 0.058 |
| 1371.0 | 0.06 |
| 1370.0 | 0.058 |
| 1369.0 | 0.052 |
| 1368.0 | 0.044 |
| 1367.0 | 0.036 |
| 1366.0 | 0.031 |
| 1365.0 | 0.03 |
| 1364.0 | 0.032 |
| 1363.0 | 0.038 |
| 1362.0 | 0.043 |
| 1361.0 | 0.048 |
| 1360.0 | 0.049 |
| 1359.0 | 0.047 |
| 1358.0 | 0.041 |
| 1357.0 | 0.034 |
| 1356.0 | 0.029 |
| 1355.0 | 0.026 |
| 1354.0 | 0.028 |
| 1353.0 | 0.033 |
| 1352.0 | 0.041 |
| 1351.0 | 0.048 |
| 1350.0 | 0.054 |
| 1349.0 | 0.055 |
| 1348.0 | 0.052 |
| 1347.0 | 0.044 |
| 1346.0 | 0.036 |
| 1345.0 | 0.027 |
| 1344.0 | 0.02 |
| 1343.0 | 0.017 |
| 1342.0 | 0.017 |
| 1341.0 | 0.019 |
| 1340.0 | 0.023 |
| 1339.0 | 0.026 |
| 1338.0 | 0.027 |
| 1337.0 | 0.027 |
| 1336.0 | 0.024 |
| 1335.0 | 0.02 |
| 1334.0 | 0.016 |
| 1333.0 | 0.012 |
| 1332.0 | 0.009 |
| 1331.0 | 0.007 |
| 1330.0 | 0.006 |
| 1329.0 | 0.006 |
| 1328.0 | 0.005 |
| 1327.0 | 0.005 |
| 1326.0 | 0.006 |
| 1325.0 | 0.006 |
| 1324.0 | 0.006 |
| 1323.0 | 0.006 |
| 1322.0 | 0.006 |
| 1321.0 | 0.005 |
| 1320.0 | 0.005 |
| 1319.0 | 0.005 |
| 1318.0 | 0.004 |
| 1317.0 | 0.004 |
| 1316.0 | 0.004 |
| 1315.0 | 0.003 |
| 1314.0 | 0.003 |
| 1313.0 | 0.003 |
| 1312.0 | 0.003 |
| 1311.0 | 0.003 |
| 1310.0 | 0.003 |
| 1309.0 | 0.003 |
| 1308.0 | 0.003 |
| 1307.0 | 0.003 |
| 1306.0 | 0.003 |
| 1305.0 | 0.003 |
| 1304.0 | 0.003 |
| 1303.0 | 0.003 |
| 1302.0 | 0.002 |
| 1301.0 | 0.002 |
| 1300.0 | 0.002 |
| 1299.0 | 0.002 |
| 1298.0 | 0.002 |
| 1297.0 | 0.003 |
| 1296.0 | 0.003 |
| 1295.0 | 0.003 |
| 1294.0 | 0.003 |
| 1293.0 | 0.003 |
| 1292.0 | 0.003 |
| 1291.0 | 0.002 |
| 1290.0 | 0.002 |
| 1289.0 | 0.002 |
| 1288.0 | 0.002 |
| 1287.0 | 0.002 |
| 1286.0 | 0.002 |
| 1285.0 | 0.002 |
| 1284.0 | 0.002 |
| 1283.0 | 0.002 |
| 1282.0 | 0.002 |
| 1281.0 | 0.002 |
| 1280.0 | 0.002 |
| 1279.0 | 0.002 |
| 1278.0 | 0.003 |
| 1277.0 | 0.003 |
| 1276.0 | 0.002 |
| 1275.0 | 0.002 |
| 1274.0 | 0.002 |
| 1273.0 | 0.002 |
| 1272.0 | 0.002 |
| 1271.0 | 0.002 |
| 1270.0 | 0.002 |
| 1269.0 | 0.002 |
| 1268.0 | 0.002 |
| 1267.0 | 0.002 |
| 1266.0 | 0.002 |
| 1265.0 | 0.002 |
| 1264.0 | 0.002 |
| 1263.0 | 0.002 |
| 1262.0 | 0.002 |
| 1261.0 | 0.002 |
| 1260.0 | 0.002 |
| 1259.0 | 0.002 |
| 1258.0 | 0.002 |
| 1257.0 | 0.002 |
| 1256.0 | 0.002 |
| 1255.0 | 0.002 |
| 1254.0 | 0.003 |
| 1253.0 | 0.003 |
| 1252.0 | 0.003 |
| 1251.0 | 0.003 |
| 1250.0 | 0.003 |
| 1249.0 | 0.002 |
| 1248.0 | 0.003 |
| 1247.0 | 0.003 |
| 1246.0 | 0.003 |
| 1245.0 | 0.003 |
| 1244.0 | 0.003 |
| 1243.0 | 0.003 |
| 1242.0 | 0.003 |
| 1241.0 | 0.003 |
| 1240.0 | 0.003 |
| 1239.0 | 0.003 |
| 1238.0 | 0.003 |
| 1237.0 | 0.003 |
| 1236.0 | 0.003 |
| 1235.0 | 0.003 |
| 1234.0 | 0.003 |
| 1233.0 | 0.003 |
| 1232.0 | 0.003 |
| 1231.0 | 0.003 |
| 1230.0 | 0.003 |
| 1229.0 | 0.003 |
| 1228.0 | 0.003 |
| 1227.0 | 0.003 |
| 1226.0 | 0.003 |
| 1225.0 | 0.003 |
| 1224.0 | 0.003 |
| 1223.0 | 0.003 |
| 1222.0 | 0.003 |
| 1221.0 | 0.003 |
| 1220.0 | 0.003 |
| 1219.0 | 0.003 |
| 1218.0 | 0.003 |
| 1217.0 | 0.003 |
| 1216.0 | 0.003 |
| 1215.0 | 0.003 |
| 1214.0 | 0.003 |
| 1213.0 | 0.003 |
| 1212.0 | 0.003 |
| 1211.0 | 0.003 |
| 1210.0 | 0.003 |
| 1209.0 | 0.003 |
| 1208.0 | 0.003 |
| 1207.0 | 0.003 |
| 1206.0 | 0.003 |
| 1205.0 | 0.003 |
| 1204.0 | 0.003 |
| 1203.0 | 0.003 |
| 1202.0 | 0.003 |
| 1201.0 | 0.003 |
| 1200.0 | 0.003 |
| 1199.0 | 0.003 |
| 1198.0 | 0.003 |
| 1197.0 | 0.003 |
| 1196.0 | 0.003 |
| 1195.0 | 0.003 |
| 1194.0 | 0.003 |
| 1193.0 | 0.003 |
| 1192.0 | 0.003 |
| 1191.0 | 0.003 |
| 1190.0 | 0.003 |
| 1189.0 | 0.003 |
| 1188.0 | 0.003 |
| 1187.0 | 0.003 |
| 1186.0 | 0.003 |
| 1185.0 | 0.003 |
| 1184.0 | 0.003 |
| 1183.0 | 0.003 |
| 1182.0 | 0.003 |
| 1181.0 | 0.003 |
| 1180.0 | 0.003 |
| 1179.0 | 0.003 |
| 1178.0 | 0.003 |
| 1177.0 | 0.003 |
| 1176.0 | 0.003 |
| 1175.0 | 0.003 |
| 1174.0 | 0.002 |
| 1173.0 | 0.002 |
| 1172.0 | 0.003 |
| 1171.0 | 0.003 |
| 1170.0 | 0.003 |
| 1169.0 | 0.003 |
| 1168.0 | 0.003 |
| 1167.0 | 0.002 |
| 1166.0 | 0.002 |
| 1165.0 | 0.003 |
| 1164.0 | 0.003 |
| 1163.0 | 0.003 |
| 1162.0 | 0.002 |
| 1161.0 | 0.002 |
| 1160.0 | 0.002 |
| 1159.0 | 0.002 |
| 1158.0 | 0.002 |
| 1157.0 | 0.003 |
| 1156.0 | 0.003 |
| 1155.0 | 0.002 |
| 1154.0 | 0.002 |
| 1153.0 | 0.002 |
| 1152.0 | 0.002 |
| 1151.0 | 0.002 |
| 1150.0 | 0.002 |
| 1149.0 | 0.002 |
| 1148.0 | 0.002 |
| 1147.0 | 0.002 |
| 1146.0 | 0.002 |
| 1145.0 | 0.002 |
| 1144.0 | 0.002 |
| 1143.0 | 0.002 |
| 1142.0 | 0.002 |
| 1141.0 | 0.002 |
| 1140.0 | 0.002 |
| 1139.0 | 0.002 |
| 1138.0 | 0.002 |
| 1137.0 | 0.002 |
| 1136.0 | 0.002 |
| 1135.0 | 0.002 |
| 1134.0 | 0.002 |
| 1133.0 | 0.002 |
| 1132.0 | 0.002 |
| 1131.0 | 0.002 |
| 1130.0 | 0.002 |
| 1129.0 | 0.002 |
| 1128.0 | 0.002 |
| 1127.0 | 0.002 |
| 1126.0 | 0.002 |
| 1125.0 | 0.002 |
| 1124.0 | 0.002 |
| 1123.0 | 0.002 |
| 1122.0 | 0.002 |
| 1121.0 | 0.002 |
| 1120.0 | 0.002 |
| 1119.0 | 0.002 |
| 1118.0 | 0.002 |
| 1117.0 | 0.002 |
| 1116.0 | 0.002 |
| 1115.0 | 0.002 |
| 1114.0 | 0.002 |
| 1113.0 | 0.002 |
| 1112.0 | 0.002 |
| 1111.0 | 0.002 |
| 1110.0 | 0.002 |
| 1109.0 | 0.002 |
| 1108.0 | 0.002 |
| 1107.0 | 0.002 |
| 1106.0 | 0.002 |
| 1105.0 | 0.002 |
| 1104.0 | 0.002 |
| 1103.0 | 0.002 |
| 1102.0 | 0.002 |
| 1101.0 | 0.002 |
| 1100.0 | 0.002 |
| 1099.0 | 0.002 |
| 1098.0 | 0.002 |
| 1097.0 | 0.002 |
| 1096.0 | 0.002 |
| 1095.0 | 0.002 |
| 1094.0 | 0.002 |
| 1093.0 | 0.002 |
| 1092.0 | 0.002 |
| 1091.0 | 0.003 |
| 1090.0 | 0.002 |
| 1089.0 | 0.002 |
| 1088.0 | 0.002 |
| 1087.0 | 0.002 |
| 1086.0 | 0.002 |
| 1085.0 | 0.002 |
| 1084.0 | 0.002 |
| 1083.0 | 0.002 |
| 1082.0 | 0.002 |
| 1081.0 | 0.002 |
| 1080.0 | 0.003 |
| 1079.0 | 0.003 |
| 1078.0 | 0.002 |
| 1077.0 | 0.002 |
| 1076.0 | 0.002 |
| 1075.0 | 0.003 |
| 1074.0 | 0.003 |
| 1073.0 | 0.003 |
| 1072.0 | 0.003 |
| 1071.0 | 0.002 |
| 1070.0 | 0.003 |
| 1069.0 | 0.003 |
| 1068.0 | 0.003 |
| 1067.0 | 0.003 |
| 1066.0 | 0.003 |
| 1065.0 | 0.002 |
| 1064.0 | 0.003 |
| 1063.0 | 0.003 |
| 1062.0 | 0.003 |
| 1061.0 | 0.003 |
| 1060.0 | 0.003 |
| 1059.0 | 0.003 |
| 1058.0 | 0.003 |
| 1057.0 | 0.003 |
| 1056.0 | 0.003 |
| 1055.0 | 0.003 |
| 1054.0 | 0.003 |
| 1053.0 | 0.003 |
| 1052.0 | 0.003 |
| 1051.0 | 0.003 |
| 1050.0 | 0.003 |
| 1049.0 | 0.003 |
| 1048.0 | 0.003 |
| 1047.0 | 0.003 |
| 1046.0 | 0.004 |
| 1045.0 | 0.004 |
| 1044.0 | 0.004 |
| 1043.0 | 0.003 |
| 1042.0 | 0.003 |
| 1041.0 | 0.003 |
| 1040.0 | 0.004 |
| 1039.0 | 0.004 |
| 1038.0 | 0.003 |
| 1037.0 | 0.003 |
| 1036.0 | 0.004 |
| 1035.0 | 0.004 |
| 1034.0 | 0.004 |
| 1033.0 | 0.003 |
| 1032.0 | 0.003 |
| 1031.0 | 0.004 |
| 1030.0 | 0.004 |
| 1029.0 | 0.004 |
| 1028.0 | 0.003 |
| 1027.0 | 0.004 |
| 1026.0 | 0.004 |
| 1025.0 | 0.004 |
| 1024.0 | 0.004 |
| 1023.0 | 0.004 |
| 1022.0 | 0.004 |
| 1021.0 | 0.005 |
| 1020.0 | 0.005 |
| 1019.0 | 0.005 |
| 1018.0 | 0.005 |
| 1017.0 | 0.005 |
| 1016.0 | 0.005 |
| 1015.0 | 0.005 |
| 1014.0 | 0.005 |
| 1013.0 | 0.005 |
| 1012.0 | 0.005 |
| 1011.0 | 0.006 |
| 1010.0 | 0.006 |
| 1009.0 | 0.005 |
| 1008.0 | 0.005 |
| 1007.0 | 0.005 |
| 1006.0 | 0.006 |
| 1005.0 | 0.006 |
| 1004.0 | 0.007 |
| 1003.0 | 0.01 |
| 1002.0 | 0.014 |
| 1001.0 | 0.137 |
| 1000.0 | 0.264 |
| 999.0 | 0.306 |
| 998.0 | 0.338 |
| 997.0 | 0.376 |
| 996.0 | 0.513 |
| 995.0 | 0.605 |
| 994.0 | 0.926 |
| 993.0 | 1.381 |
| 992.0 | 2.258 |
| 991.0 | 2.828 |
| 990.0 | 2.91 |
| 989.0 | 3.794 |
| 988.0 | 4.098 |
| 987.0 | 4.293 |
| 986.0 | 4.681 |
| 985.0 | 4.961 |
| 984.0 | 5.075 |
| 983.0 | 5.351 |
| 982.0 | 5.668 |
| 981.0 | 5.92 |
| 980.0 | 6.009 |
| 979.0 | 5.986 |
| 978.0 | 5.991 |
| 977.0 | 5.882 |
| 976.0 | 6.041 |
| 975.0 | 5.958 |
| 974.0 | 5.292 |
| 973.0 | 5.092 |
| 972.0 | 4.957 |
| 971.0 | 4.893 |
| 970.0 | 4.718 |
| 969.0 | 4.089 |
| 968.0 | 3.742 |
| 967.0 | 2.94 |
| 966.0 | 2.887 |
| 965.0 | 2.673 |
| 964.0 | 2.023 |
| 963.0 | 1.349 |
| 962.0 | 0.903 |
| 961.0 | 0.613 |
| 960.0 | 0.389 |
| 959.0 | 0.232 |
| 958.0 | 0.131 |
| 957.0 | 0.067 |
| 956.0 | 0.031 |
| 955.0 | 0.016 |
| 954.0 | 0.011 |
| 953.0 | 0.008 |
| 952.0 | 0.006 |
| 951.0 | 0.005 |
| 950.0 | 0.005 |
| 949.0 | 0.005 |
| 948.0 | 0.005 |
| 947.0 | 0.005 |
| 946.0 | 0.005 |
| 945.0 | 0.005 |
| 944.0 | 0.005 |
| 943.0 | 0.005 |
| 942.0 | 0.005 |
| 941.0 | 0.005 |
| 940.0 | 0.005 |
| 939.0 | 0.005 |
| 938.0 | 0.004 |
| 937.0 | 0.004 |
| 936.0 | 0.004 |
| 935.0 | 0.004 |
| 934.0 | 0.004 |
| 933.0 | 0.005 |
| 932.0 | 0.005 |
| 931.0 | 0.005 |
| 930.0 | 0.005 |
| 929.0 | 0.005 |
| 928.0 | 0.005 |
| 927.0 | 0.004 |
| 926.0 | 0.004 |
| 925.0 | 0.004 |
| 924.0 | 0.004 |
| 923.0 | 0.004 |
| 922.0 | 0.004 |
| 921.0 | 0.004 |
| 920.0 | 0.004 |
| 919.0 | 0.004 |
| 918.0 | 0.004 |
| 917.0 | 0.004 |
| 916.0 | 0.004 |
| 915.0 | 0.004 |
| 914.0 | 0.004 |
| 913.0 | 0.004 |
| 912.0 | 0.004 |
| 911.0 | 0.004 |
| 910.0 | 0.004 |
| 909.0 | 0.004 |
| 908.0 | 0.004 |
| 907.0 | 0.004 |
| 906.0 | 0.004 |
| 905.0 | 0.004 |
| 904.0 | 0.004 |
| 903.0 | 0.004 |
| 902.0 | 0.004 |
| 901.0 | 0.004 |
| 900.0 | 0.004 |
| 899.0 | 0.004 |
| 898.0 | 0.004 |
| 897.0 | 0.004 |
| 896.0 | 0.004 |
| 895.0 | 0.003 |
| 894.0 | 0.003 |
| 893.0 | 0.003 |
| 892.0 | 0.003 |
| 891.0 | 0.003 |
| 890.0 | 0.003 |
| 889.0 | 0.003 |
| 888.0 | 0.003 |
| 887.0 | 0.003 |
| 886.0 | 0.003 |
| 885.0 | 0.003 |
| 884.0 | 0.003 |
| 883.0 | 0.003 |
| 882.0 | 0.003 |
| 881.0 | 0.003 |
| 880.0 | 0.003 |
| 879.0 | 0.003 |
| 878.0 | 0.003 |
| 877.0 | 0.003 |
| 876.0 | 0.003 |
| 875.0 | 0.003 |
| 874.0 | 0.003 |
| 873.0 | 0.003 |
| 872.0 | 0.003 |
| 871.0 | 0.003 |
| 870.0 | 0.003 |
| 869.0 | 0.003 |
| 868.0 | 0.003 |
| 867.0 | 0.003 |
| 866.0 | 0.003 |
| 865.0 | 0.003 |
| 864.0 | 0.003 |
| 863.0 | 0.003 |
| 862.0 | 0.003 |
| 861.0 | 0.003 |
| 860.0 | 0.003 |
| 859.0 | 0.003 |
| 858.0 | 0.003 |
| 857.0 | 0.003 |
| 856.0 | 0.003 |
| 855.0 | 0.003 |
| 854.0 | 0.003 |
| 853.0 | 0.003 |
| 852.0 | 0.003 |
| 851.0 | 0.003 |
| 850.0 | 0.003 |
| 849.0 | 0.004 |
| 848.0 | 0.004 |
| 847.0 | 0.005 |
| 846.0 | 0.004 |
| 845.0 | 0.004 |
| 844.0 | 0.004 |
| 843.0 | 0.004 |
| 842.0 | 0.004 |
| 841.0 | 0.004 |
| 840.0 | 0.004 |
| 839.0 | 0.004 |
| 838.0 | 0.004 |
| 837.0 | 0.005 |
| 836.0 | 0.004 |
| 835.0 | 0.004 |
| 834.0 | 0.004 |
| 833.0 | 0.005 |
| 832.0 | 0.004 |
| 831.0 | 0.005 |
| 830.0 | 0.004 |
| 829.0 | 0.004 |
| 828.0 | 0.004 |
| 827.0 | 0.004 |
| 826.0 | 0.004 |
| 825.0 | 0.005 |
| 824.0 | 0.005 |
| 823.0 | 0.005 |
| 822.0 | 0.005 |
| 821.0 | 0.005 |
| 820.0 | 0.005 |
| 819.0 | 0.005 |
| 818.0 | 0.005 |
| 817.0 | 0.005 |
| 816.0 | 0.005 |
| 815.0 | 0.005 |
| 814.0 | 0.005 |
| 813.0 | 0.005 |
| 812.0 | 0.005 |
| 811.0 | 0.005 |
| 810.0 | 0.005 |
| 809.0 | 0.005 |
| 808.0 | 0.006 |
| 807.0 | 0.006 |
| 806.0 | 0.006 |
| 805.0 | 0.006 |
| 804.0 | 0.006 |
| 803.0 | 0.006 |
| 802.0 | 0.006 |
| 801.0 | 0.006 |
| 800.0 | 0.005 |
| 799.0 | 0.005 |
| 798.0 | 0.005 |
| 797.0 | 0.005 |
| 796.0 | 0.005 |
| 795.0 | 0.005 |
| 794.0 | 0.005 |
| 793.0 | 0.005 |
| 792.0 | 0.005 |
| 791.0 | 0.005 |
| 790.0 | 0.006 |
| 789.0 | 0.006 |
| 788.0 | 0.006 |
| 787.0 | 0.006 |
| 786.0 | 0.005 |
| 785.0 | 0.005 |
| 784.0 | 0.006 |
| 783.0 | 0.005 |
| 782.0 | 0.006 |
| 781.0 | 0.006 |
| 780.0 | 0.006 |
| 779.0 | 0.005 |
| 778.0 | 0.005 |
| 777.0 | 0.006 |
| 776.0 | 0.005 |
| 775.0 | 0.005 |
| 774.0 | 0.005 |
| 773.0 | 0.006 |
| 772.0 | 0.006 |
| 771.0 | 0.006 |
| 770.0 | 0.006 |
| 769.0 | 0.006 |
| 768.0 | 0.006 |
| 767.0 | 0.006 |
| 766.0 | 0.005 |
| 765.0 | 0.006 |
| 764.0 | 0.006 |
| 763.0 | 0.006 |
| 762.0 | 0.006 |
| 761.0 | 0.006 |
| 760.0 | 0.005 |
| 759.0 | 0.006 |
| 758.0 | 0.006 |
| 757.0 | 0.006 |
| 756.0 | 0.005 |
| 755.0 | 0.005 |
| 754.0 | 0.005 |
| 753.0 | 0.005 |
| 752.0 | 0.005 |
| 751.0 | 0.005 |
| 750.0 | 0.004 |
| 749.0 | 0.004 |
| 748.0 | 0.005 |
| 747.0 | 0.005 |
| 746.0 | 0.004 |
| 745.0 | 0.004 |
| 744.0 | 0.004 |
| 743.0 | 0.004 |
| 742.0 | 0.004 |
| 741.0 | 0.005 |
| 740.0 | 0.005 |
| 739.0 | 0.005 |
| 738.0 | 0.006 |
| 737.0 | 0.006 |
| 736.0 | 0.005 |
| 735.0 | 0.005 |
| 734.0 | 0.005 |
| 733.0 | 0.005 |
| 732.0 | 0.005 |
| 731.0 | 0.005 |
| 730.0 | 0.006 |
| 729.0 | 0.006 |
| 728.0 | 0.005 |
| 727.0 | 0.005 |
| 726.0 | 0.005 |
| 725.0 | 0.006 |
| 724.0 | 0.006 |
| 723.0 | 0.006 |
| 722.0 | 0.007 |
| 721.0 | 0.007 |
| 720.0 | 0.007 |
| 719.0 | 0.006 |
| 718.0 | 0.006 |
| 717.0 | 0.007 |
| 716.0 | 0.007 |
| 715.0 | 0.008 |
| 714.0 | 0.008 |
| 713.0 | 0.008 |
| 712.0 | 0.009 |
| 711.0 | 0.009 |
| 710.0 | 0.01 |
| 709.0 | 0.01 |
| 708.0 | 0.011 |
| 707.0 | 0.01 |
| 706.0 | 0.009 |
| 705.0 | 0.009 |
| 704.0 | 0.009 |
| 703.0 | 0.009 |
| 702.0 | 0.009 |
| 701.0 | 0.009 |
| 700.0 | 0.01 |
| 699.0 | 0.009 |
| 698.0 | 0.009 |
| 697.0 | 0.01 |
| 696.0 | 0.011 |
| 695.0 | 0.011 |
| 694.0 | 0.011 |
| 693.0 | 0.011 |
| 692.0 | 0.012 |
| 691.0 | 0.012 |
| 690.0 | 0.013 |
| 689.0 | 0.015 |
| 688.0 | 0.016 |
| 687.0 | 0.017 |
| 686.0 | 0.017 |
| 685.0 | 0.016 |
| 684.0 | 0.016 |
| 683.0 | 0.017 |
| 682.0 | 0.016 |
| 681.0 | 0.015 |
| 680.0 | 0.014 |
| 679.0 | 0.014 |
| 678.0 | 0.014 |
| 677.0 | 0.021 |
| 676.0 | 0.051 |
| 675.0 | 0.145 |
| 674.0 | 0.344 |
| 673.0 | 0.598 |
| 672.0 | 0.796 |
| 671.0 | 0.992 |
| 670.0 | 1.164 |
| 669.0 | 1.261 |
| 668.0 | 1.36 |
| 667.0 | 1.506 |
| 666.0 | 1.727 |
| 665.0 | 1.942 |
| 664.0 | 1.992 |
| 663.0 | 1.958 |
| 662.0 | 2.114 |
| 661.0 | 2.551 |
| 660.0 | 3.311 |
| 659.0 | 4.407 |
| 658.0 | 4.392 |
| 657.0 | 4.412 |
| 656.0 | 4.389 |
| 655.0 | 4.392 |
| 654.0 | 4.387 |
| 653.0 | 4.381 |
| 652.0 | 4.382 |
| 651.0 | 4.38 |
| 650.0 | 4.383 |
| 649.0 | 4.37 |
| 648.0 | 4.37 |
| 647.0 | 4.373 |
| 646.0 | 4.364 |
| 645.0 | 4.367 |
| 644.0 | 4.384 |
| 643.0 | 4.379 |
| 642.0 | 4.367 |
| 641.0 | 4.366 |
| 640.0 | 4.408 |
| 639.0 | 4.389 |
| 638.0 | 4.379 |
| 637.0 | 4.401 |
| 636.0 | 4.38 |
| 635.0 | 4.38 |
| 634.0 | 4.393 |
| 633.0 | 4.379 |
| 632.0 | 4.413 |
| 631.0 | 4.398 |
| 630.0 | 4.409 |
| 629.0 | 4.413 |
| 628.0 | 4.403 |
| 627.0 | 4.404 |
| 626.0 | 4.403 |
| 625.0 | 4.409 |
| 624.0 | 4.412 |
| 623.0 | 4.404 |
| 622.0 | 4.423 |
| 621.0 | 4.433 |
| 620.0 | 4.418 |
| 619.0 | 4.415 |
| 618.0 | 4.439 |
| 617.0 | 4.416 |
| 616.0 | 4.412 |
| 615.0 | 4.419 |
| 614.0 | 4.433 |
| 613.0 | 4.398 |
| 612.0 | 4.397 |
| 611.0 | 4.408 |
| 610.0 | 4.396 |
| 609.0 | 4.4 |
| 608.0 | 4.394 |
| 607.0 | 4.391 |
| 606.0 | 4.388 |
| 605.0 | 4.395 |
| 604.0 | 4.367 |
| 603.0 | 4.374 |
| 602.0 | 4.385 |
| 601.0 | 4.38 |
| 600.0 | 4.404 |
| 599.0 | 4.38 |
| 598.0 | 4.391 |
| 597.0 | 4.379 |
| 596.0 | 4.397 |
| 595.0 | 4.377 |
| 594.0 | 4.396 |
| 593.0 | 4.409 |
| 592.0 | 4.403 |
| 591.0 | 4.414 |
| 590.0 | 4.406 |
| 589.0 | 4.4 |
| 588.0 | 4.424 |
| 587.0 | 4.408 |
| 586.0 | 4.432 |
| 585.0 | 4.438 |
| 584.0 | 4.425 |
| 583.0 | 4.414 |
| 582.0 | 4.447 |
| 581.0 | 4.439 |
| 580.0 | 4.438 |
| 579.0 | 4.424 |
| 578.0 | 4.46 |
| 577.0 | 4.455 |
| 576.0 | 4.455 |
| 575.0 | 4.431 |
| 574.0 | 4.429 |
| 573.0 | 4.453 |
| 572.0 | 4.447 |
| 571.0 | 4.452 |
| 570.0 | 4.466 |
| 569.0 | 4.454 |
| 568.0 | 4.462 |
| 567.0 | 4.453 |
| 566.0 | 4.465 |
| 565.0 | 4.476 |
| 564.0 | 4.475 |
| 563.0 | 4.473 |
| 562.0 | 4.468 |
| 561.0 | 4.473 |
| 560.0 | 4.479 |
| 559.0 | 4.464 |
| 558.0 | 4.477 |
| 557.0 | 4.482 |
| 556.0 | 4.482 |
| 555.0 | 4.467 |
| 554.0 | 4.47 |
| 553.0 | 4.463 |
| 552.0 | 4.488 |
| 551.0 | 4.482 |
| 550.0 | 4.482 |
| 549.0 | 4.477 |
| 548.0 | 4.48 |
| 547.0 | 4.477 |
| 546.0 | 4.475 |
| 545.0 | 4.481 |
| 544.0 | 4.473 |
| 543.0 | 4.516 |
| 542.0 | 4.499 |
| 541.0 | 4.465 |
| 540.0 | 4.475 |
| 539.0 | 4.47 |
| 538.0 | 4.473 |
| 537.0 | 4.463 |
| 536.0 | 4.479 |
| 535.0 | 4.492 |
| 534.0 | 4.465 |
| 533.0 | 4.484 |
| 532.0 | 4.477 |
| 531.0 | 4.503 |
| 530.0 | 4.499 |
| 529.0 | 4.469 |
| 528.0 | 4.468 |
| 527.0 | 4.471 |
| 526.0 | 4.474 |
| 525.0 | 4.482 |
| 524.0 | 4.475 |
| 523.0 | 4.473 |
| 522.0 | 4.482 |
| 521.0 | 4.47 |
| 520.0 | 4.462 |
| 519.0 | 4.478 |
| 518.0 | 4.467 |
| 517.0 | 4.481 |
| 516.0 | 4.459 |
| 515.0 | 4.471 |
| 514.0 | 4.493 |
| 513.0 | 4.492 |
| 512.0 | 4.479 |
| 511.0 | 4.467 |
| 510.0 | 4.468 |
| 509.0 | 4.47 |
| 508.0 | 4.469 |
| 507.0 | 4.479 |
| 506.0 | 4.475 |
| 505.0 | 4.472 |
| 504.0 | 4.48 |
| 503.0 | 4.493 |
| 502.0 | 4.494 |
| 501.0 | 4.48 |
| 500.0 | 4.474 |
| 499.0 | 4.485 |
| 498.0 | 4.466 |
| 497.0 | 4.478 |
| 496.0 | 4.524 |
| 495.0 | 4.522 |
| 494.0 | 4.494 |
| 493.0 | 4.476 |
| 492.0 | 4.482 |
| 491.0 | 4.5 |
| 490.0 | 4.502 |
| 489.0 | 4.528 |
| 488.0 | 4.514 |
| 487.0 | 4.495 |
| 486.0 | 4.545 |
| 485.0 | 4.597 |
| 484.0 | 4.67 |
| 483.0 | 4.597 |
| 482.0 | 4.522 |
| 481.0 | 4.518 |
| 480.0 | 4.586 |
| 479.0 | 3.8 |
| 478.0 | 2.934 |
| 477.0 | 2.658 |
| 476.0 | 2.745 |
| 475.0 | 3.064 |
| 474.0 | 3.202 |
| 473.0 | 3.004 |
| 472.0 | 2.848 |
| 471.0 | 2.313 |
| 470.0 | 1.443 |
| 469.0 | 1.132 |
| 468.0 | 1.159 |
| 467.0 | 1.36 |
| 466.0 | 1.244 |
| 465.0 | 0.901 |
| 464.0 | 0.772 |
| 463.0 | 0.974 |
| 462.0 | 1.517 |
| 461.0 | 1.899 |
| 460.0 | 1.808 |
| 459.0 | 1.769 |
| 458.0 | 1.838 |
| 457.0 | 1.714 |
| 456.0 | 1.126 |
| 455.0 | 0.878 |
| 454.0 | 0.994 |
| 453.0 | 1.439 |
| 452.0 | 2.102 |
| 451.0 | 1.7 |
| 450.0 | 1.341 |
| 449.0 | 1.265 |
| 448.0 | 1.522 |
| 447.0 | 1.868 |
| 446.0 | 1.519 |
| 445.0 | 1.323 |
| 444.0 | 1.373 |
| 443.0 | 1.43 |
| 442.0 | 1.014 |
| 441.0 | 0.757 |
| 440.0 | 0.796 |
| 439.0 | 0.949 |
| 438.0 | 0.902 |
| 437.0 | 0.792 |
| 436.0 | 0.765 |
| 435.0 | 0.795 |
| 434.0 | 0.959 |
| 433.0 | 1.303 |
| 432.0 | 1.506 |
| 431.0 | 1.362 |
| 430.0 | 1.344 |
| 429.0 | 1.366 |
| 428.0 | 1.296 |
| 427.0 | 1.311 |
| 426.0 | 1.441 |
| 425.0 | 1.571 |
| 424.0 | 1.708 |
| 423.0 | 1.762 |
| 422.0 | 1.776 |
| 421.0 | 2.057 |
| 420.0 | 2.961 |
| 419.0 | 4.314 |
| 418.0 | 4.531 |
| 417.0 | 4.542 |
| 416.0 | 5.041 |
| 415.0 | 4.787 |
| 414.0 | 4.811 |
| 413.0 | 5.024 |
| 412.0 | 4.645 |
| 411.0 | 4.601 |
| 410.0 | 4.509 |
| 409.0 | 4.532 |
| 408.0 | 4.511 |
| 407.0 | 4.542 |
| 406.0 | 4.499 |
| 405.0 | 4.553 |
| 404.0 | 4.534 |
| 403.0 | 4.531 |
| 402.0 | 4.562 |
| 401.0 | 4.596 |
| 400.0 | 4.558 |
| 399.0 | 4.563 |
| 398.0 | 4.543 |
| 397.0 | 4.536 |
| 396.0 | 4.544 |
| 395.0 | 4.549 |
| 394.0 | 4.911 |
| 393.0 | 3.378 |
| 392.0 | 2.986 |
| 391.0 | 3.018 |
| 390.0 | 3.399 |
| 389.0 | 4.328 |
| 388.0 | 4.438 |
| 387.0 | 4.29 |
| 386.0 | 3.501 |
| 385.0 | 3.121 |
| 384.0 | 3.101 |
| 383.0 | 3.352 |
| 382.0 | 3.358 |
| 381.0 | 3.17 |
| 380.0 | 3.273 |
| 379.0 | 3.76 |
| 378.0 | 4.792 |
| 377.0 | 4.259 |
| 376.0 | 3.52 |
| 375.0 | 3.312 |
| 374.0 | 3.51 |
| 373.0 | 3.979 |
| 372.0 | 4.53 |
| 371.0 | 4.771 |
| 370.0 | 5.06 |
| 369.0 | 4.788 |
| 368.0 | 4.176 |
| 367.0 | 3.224 |
| 366.0 | 2.782 |
| 365.0 | 2.649 |
| 364.0 | 2.835 |
| 363.0 | 3.346 |
| 362.0 | 2.887 |
| 361.0 | 2.364 |
| 360.0 | 2.105 |
| 359.0 | 2.077 |
| 358.0 | 2.214 |
| 357.0 | 2.465 |
| 356.0 | 2.84 |
| 355.0 | 2.81 |
| 354.0 | 2.447 |
| 353.0 | 2.32 |
| 352.0 | 2.504 |
| 351.0 | 3.051 |
| 350.0 | 4.601 |
| 349.0 | 6.336 |
| 348.0 | 5.691 |
| 347.0 | 5.511 |
| 346.0 | 5.859 |
| 345.0 | 6.266 |
| 344.0 | 6.731 |
| 343.0 | 6.303 |
| 342.0 | 5.798 |
| 341.0 | 5.574 |
| 340.0 | 6.347 |
| 339.0 | 4.689 |
| 338.0 | 4.721 |
| 337.0 | 4.761 |
| 336.0 | 4.772 |
| 335.0 | 4.733 |
| 334.0 | 4.719 |
| 333.0 | 4.803 |
| 332.0 | 4.71 |
| 331.0 | 4.718 |
| 330.0 | 4.82 |
| 329.0 | 4.708 |
| 328.0 | 4.695 |
| 327.0 | 4.685 |
| 326.0 | 4.779 |
| 325.0 | 4.688 |
| 324.0 | 4.686 |
| 323.0 | 4.681 |
| 322.0 | 4.687 |
| 321.0 | 4.678 |
| 320.0 | 4.752 |
| 319.0 | 4.682 |
| 318.0 | 4.671 |
| 317.0 | 4.686 |
| 316.0 | 4.689 |
| 315.0 | 4.723 |
| 314.0 | 4.685 |
| 313.0 | 4.674 |
| 312.0 | 4.684 |
| 311.0 | 4.65 |
| 310.0 | 4.663 |
| 309.0 | 4.651 |
| 308.0 | 4.7 |
| 307.0 | 4.7 |
| 306.0 | 4.655 |
| 305.0 | 4.697 |
| 304.0 | 4.653 |
| 303.0 | 4.654 |
| 302.0 | 4.629 |
| 301.0 | 4.67 |
| 300.0 | 4.641 |
| 299.0 | 4.684 |
| 298.0 | 4.637 |
| 297.0 | 4.657 |
| 296.0 | 4.611 |
| 295.0 | 4.604 |
| 294.0 | 4.628 |
| 293.0 | 4.615 |
| 292.0 | 4.597 |
| 291.0 | 4.634 |
| 290.0 | 4.611 |
| 289.0 | 4.586 |
| 288.0 | 4.657 |
| 287.0 | 4.569 |
| 286.0 | 4.583 |
| 285.0 | 4.601 |
| 284.0 | 4.575 |
| 283.0 | 4.552 |
| 282.0 | 4.581 |
| 281.0 | 4.598 |
| 280.0 | 4.567 |
| 279.0 | 4.565 |
| 278.0 | 4.572 |
| 277.0 | 4.599 |
| 276.0 | 4.591 |
| 275.0 | 4.564 |
| 274.0 | 4.577 |
| 273.0 | 4.561 |
| 272.0 | 4.552 |
| 271.0 | 4.561 |
| 270.0 | 4.563 |
| 269.0 | 4.536 |
| 268.0 | 4.574 |
| 267.0 | 4.557 |
| 266.0 | 4.569 |
| 265.0 | 4.543 |
| 264.0 | 4.537 |
| 263.0 | 4.539 |
| 262.0 | 4.535 |
| 261.0 | 4.508 |
| 260.0 | 4.527 |
| 259.0 | 4.54 |
| 258.0 | 4.527 |
| 257.0 | 4.526 |
| 256.0 | 4.525 |
| 255.0 | 4.546 |
| 254.0 | 4.561 |
| 253.0 | 4.539 |
| 252.0 | 4.527 |
| 251.0 | 4.541 |
| 250.0 | 4.529 |
| 249.0 | 4.555 |
| 248.0 | 4.537 |
| 247.0 | 4.558 |
| 246.0 | 4.53 |
| 245.0 | 4.537 |
| 244.0 | 4.538 |
| 243.0 | 4.545 |
| 242.0 | 4.528 |
| 241.0 | 4.525 |
| 240.0 | 4.534 |
| 239.0 | 4.528 |
| 238.0 | 4.519 |
| 237.0 | 4.51 |
| 236.0 | 4.496 |
| 235.0 | 4.511 |
| 234.0 | 4.497 |
| 233.0 | 4.531 |
| 232.0 | 4.509 |
| 231.0 | 4.523 |
| 230.0 | 4.522 |
| 229.0 | 4.496 |
| 228.0 | 4.486 |
| 227.0 | 4.513 |
| 226.0 | 4.508 |
| 225.0 | 4.5 |
| 224.0 | 4.513 |
| 223.0 | 4.483 |
| 222.0 | 4.526 |
| 221.0 | 4.493 |
| 220.0 | 4.542 |
| 219.0 | 4.534 |
| 218.0 | 4.51 |
| 217.0 | 4.552 |
| 216.0 | 4.53 |
| 215.0 | 4.553 |
| 214.0 | 4.538 |
| 213.0 | 4.573 |
| 212.0 | 4.509 |
| 211.0 | 4.564 |
| 210.0 | 4.593 |
| 209.0 | 4.544 |
| 208.0 | 4.545 |
| 207.0 | 4.549 |
| 206.0 | 4.551 |
| 205.0 | 4.572 |
| 204.0 | 4.571 |
| 203.0 | 4.603 |
| 202.0 | 4.576 |
| 201.0 | 4.537 |
| 200.0 | 4.591 |